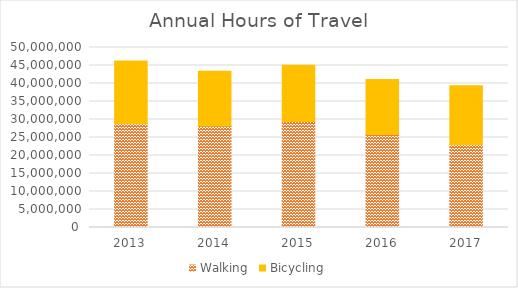
| Category | Walking | Bicycling |
|---|---|---|
| 2013 | 28818750.019 | 17400342.338 |
| 2014 | 28216652.88 | 15210255.038 |
| 2015 | 29451328.807 | 15652622.707 |
| 2016 | 25801217.379 | 15297789.962 |
| 2017 | 22997770.604 | 16394095.247 |